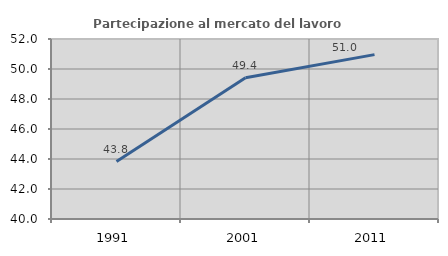
| Category | Partecipazione al mercato del lavoro  femminile |
|---|---|
| 1991.0 | 43.828 |
| 2001.0 | 49.415 |
| 2011.0 | 50.959 |